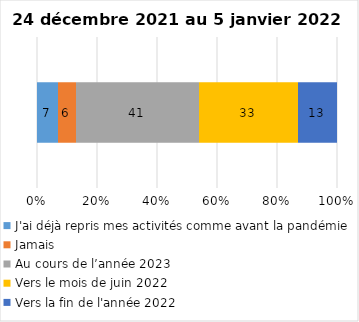
| Category | J'ai déjà repris mes activités comme avant la pandémie | Jamais | Au cours de l’année 2023 | Vers le mois de juin 2022 | Vers la fin de l'année 2022 |
|---|---|---|---|---|---|
| 0 | 7 | 6 | 41 | 33 | 13 |